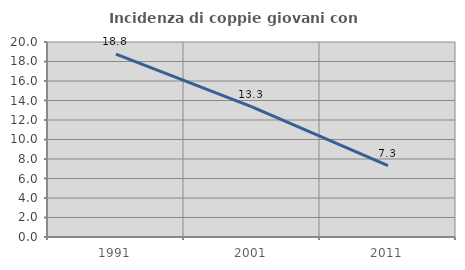
| Category | Incidenza di coppie giovani con figli |
|---|---|
| 1991.0 | 18.764 |
| 2001.0 | 13.343 |
| 2011.0 | 7.331 |